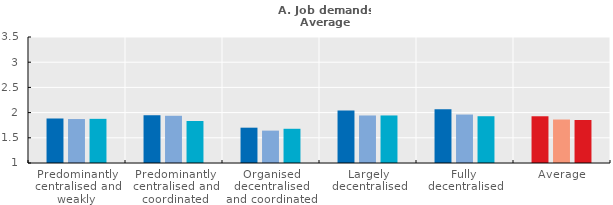
| Category | 2005 | 2010 | 2015 |
|---|---|---|---|
| Predominantly centralised and weakly co-ordinated | 1.883 | 1.872 | 1.876 |
| Predominantly centralised and coordinated | 1.948 | 1.937 | 1.833 |
| Organised decentralised and coordinated | 1.701 | 1.643 | 1.679 |
| Largely decentralised | 2.039 | 1.943 | 1.943 |
| Fully decentralised | 2.066 | 1.961 | 1.928 |
| Average | 1.927 | 1.863 | 1.853 |